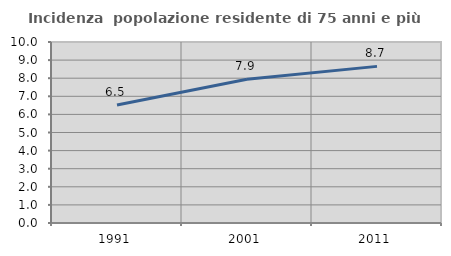
| Category | Incidenza  popolazione residente di 75 anni e più |
|---|---|
| 1991.0 | 6.523 |
| 2001.0 | 7.94 |
| 2011.0 | 8.654 |